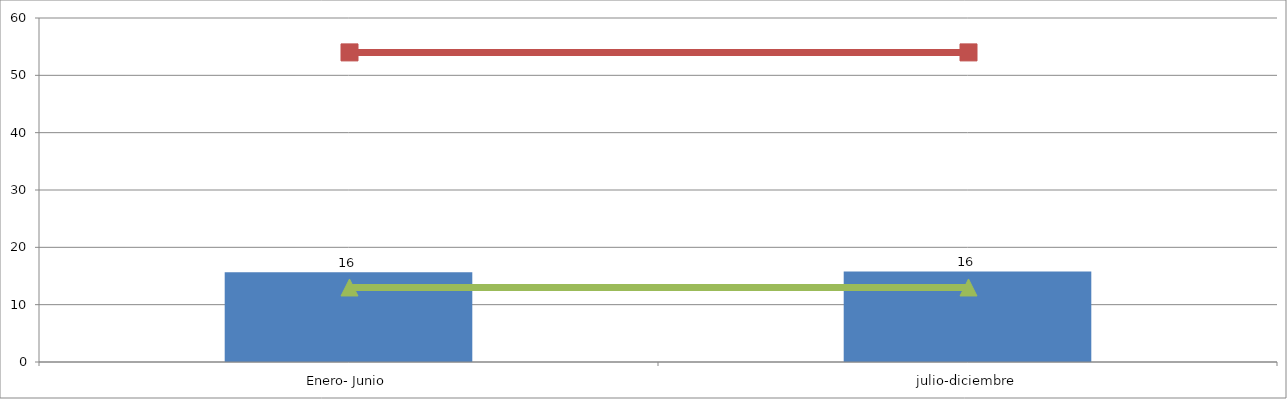
| Category | logros |
|---|---|
| Enero- Junio | 15.665 |
| julio-diciembre | 15.793 |